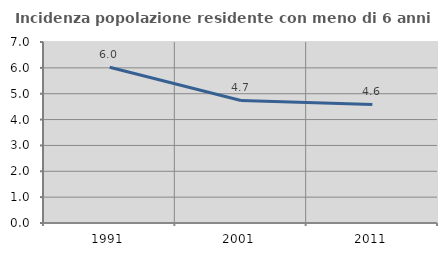
| Category | Incidenza popolazione residente con meno di 6 anni |
|---|---|
| 1991.0 | 6.022 |
| 2001.0 | 4.74 |
| 2011.0 | 4.586 |